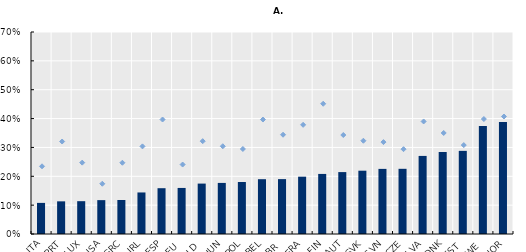
| Category | Mid-1990s |
|---|---|
| ITA | 0.108 |
| PRT | 0.113 |
| LUX | 0.114 |
| USA | 0.117 |
| GRC | 0.118 |
| IRL | 0.144 |
| ESP | 0.159 |
| DEU | 0.16 |
| NLD | 0.175 |
| HUN | 0.177 |
| POL | 0.18 |
| BEL | 0.19 |
| GBR | 0.19 |
| FRA | 0.199 |
| FIN | 0.208 |
| AUT | 0.215 |
| SVK | 0.219 |
| SVN | 0.226 |
| CZE | 0.226 |
| LVA | 0.271 |
| DNK | 0.284 |
| EST | 0.288 |
| SWE | 0.375 |
| NOR | 0.389 |